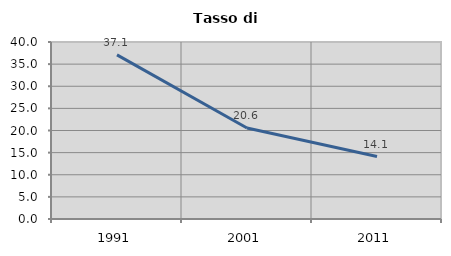
| Category | Tasso di disoccupazione   |
|---|---|
| 1991.0 | 37.1 |
| 2001.0 | 20.571 |
| 2011.0 | 14.117 |